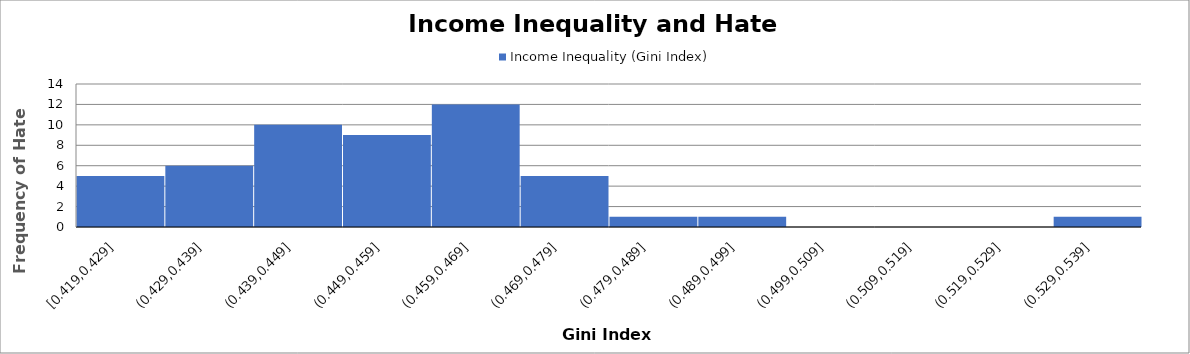
| Category | Series 0 |
|---|---|
| Income Inequality (Gini Index) | 0.454 |
| Hate Crimes (per 100, 000 Residents) | 2.368 |